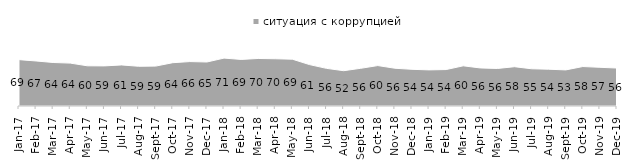
| Category | ситуация с коррупцией |
|---|---|
| 2017-01-01 | 68.7 |
| 2017-02-01 | 66.7 |
| 2017-03-01 | 64.45 |
| 2017-04-01 | 63.55 |
| 2017-05-01 | 59.55 |
| 2017-06-01 | 59.4 |
| 2017-07-01 | 60.85 |
| 2017-08-01 | 58.85 |
| 2017-09-01 | 59.1 |
| 2017-10-01 | 64.15 |
| 2017-11-01 | 65.8 |
| 2017-12-01 | 65.2 |
| 2018-01-01 | 70.95 |
| 2018-02-01 | 69 |
| 2018-03-01 | 70.4 |
| 2018-04-01 | 70 |
| 2018-05-01 | 69.35 |
| 2018-06-01 | 61.35 |
| 2018-07-01 | 55.75 |
| 2018-08-01 | 52.3 |
| 2018-09-01 | 55.85 |
| 2018-10-01 | 59.9 |
| 2018-11-01 | 55.938 |
| 2018-12-01 | 54.35 |
| 2019-01-01 | 53.5 |
| 2019-02-01 | 54 |
| 2019-03-01 | 59.523 |
| 2019-04-01 | 56.386 |
| 2019-05-01 | 55.622 |
| 2019-06-01 | 58.204 |
| 2019-07-01 | 55.149 |
| 2019-08-01 | 54.496 |
| 2019-09-01 | 53.465 |
| 2019-10-01 | 58.465 |
| 2019-11-01 | 57.327 |
| 2019-12-01 | 56.238 |